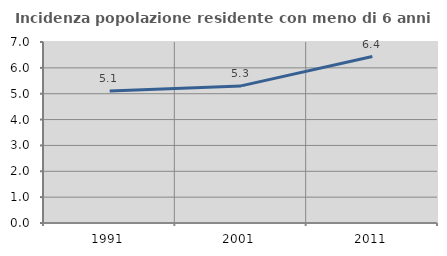
| Category | Incidenza popolazione residente con meno di 6 anni |
|---|---|
| 1991.0 | 5.106 |
| 2001.0 | 5.303 |
| 2011.0 | 6.439 |